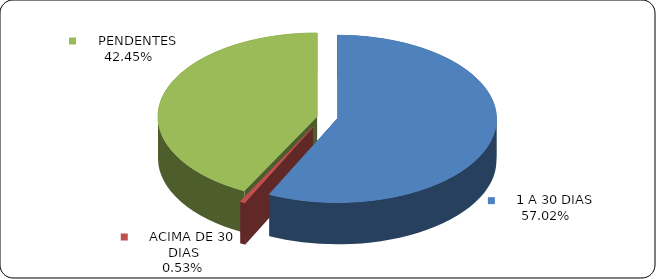
| Category | Series 0 |
|---|---|
|      1 A 30 DIAS | 0.57 |
|      ACIMA DE 30 DIAS | 0.005 |
|      PENDENTES | 0.424 |